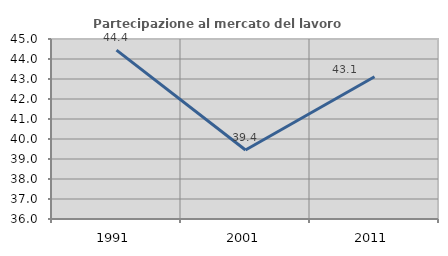
| Category | Partecipazione al mercato del lavoro  femminile |
|---|---|
| 1991.0 | 44.444 |
| 2001.0 | 39.45 |
| 2011.0 | 43.111 |